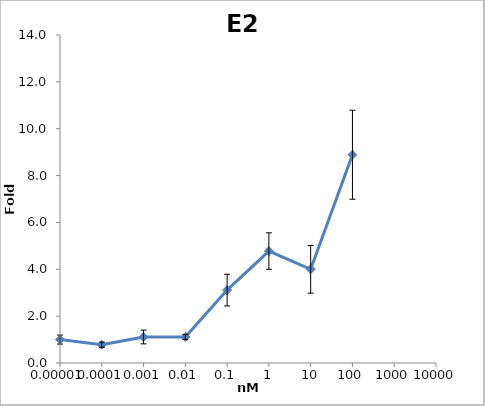
| Category | E2 |
|---|---|
| 1e-05 | 1 |
| 0.0001 | 0.778 |
| 0.001 | 1.111 |
| 0.01 | 1.111 |
| 0.1 | 3.111 |
| 1.0 | 4.778 |
| 10.0 | 4 |
| 100.0 | 8.889 |